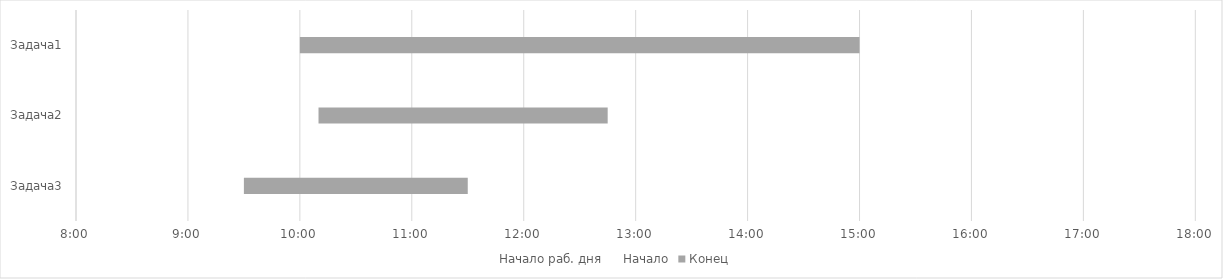
| Category | Начало раб. дня | Начало | Конец |
|---|---|---|---|
| Задача1 | 0.375 | 0.042 | 0.208 |
| Задача2 | 0.375 | 0.049 | 0.108 |
| Задача3 | 0.375 | 0.021 | 0.083 |